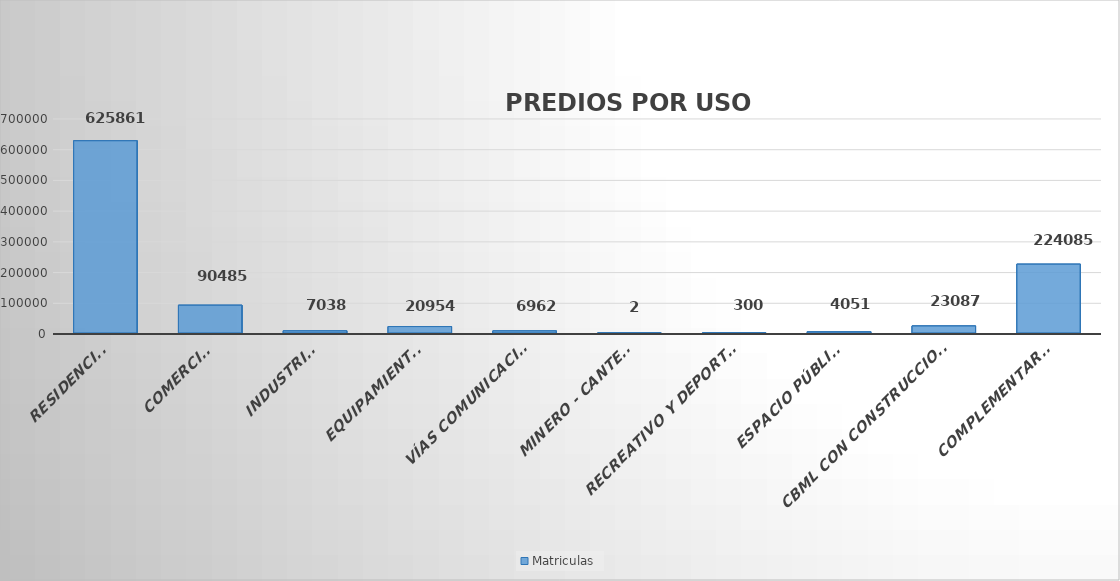
| Category | Matriculas |
|---|---|
|  RESIDENCIAL | 625861 |
| COMERCIAL  | 90485 |
| INDUSTRIAL  | 7038 |
| EQUIPAMIENTOS  | 20954 |
| VÍAS COMUNICACIÓN | 6962 |
| MINERO - CANTERAS | 2 |
| RECREATIVO Y DEPORTIVO | 300 |
| ESPACIO PÚBLICO | 4051 |
| CBML CON CONSTRUCCION - LOTES | 23087 |
| COMPLEMENTARIOS | 224085 |